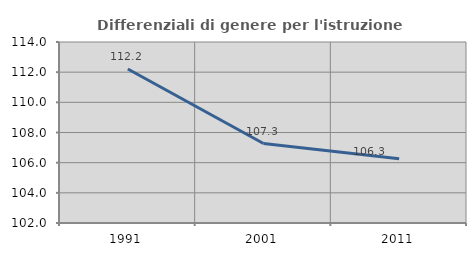
| Category | Differenziali di genere per l'istruzione superiore |
|---|---|
| 1991.0 | 112.207 |
| 2001.0 | 107.269 |
| 2011.0 | 106.263 |